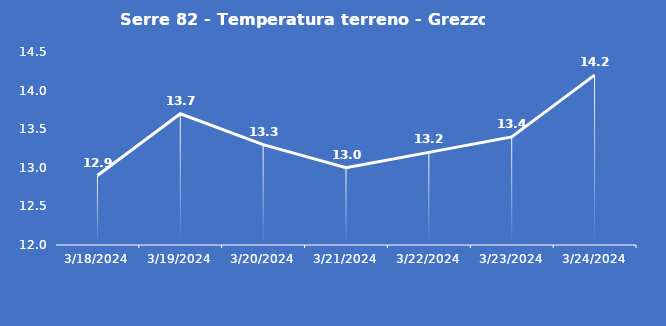
| Category | Serre 82 - Temperatura terreno - Grezzo (°C) |
|---|---|
| 3/18/24 | 12.9 |
| 3/19/24 | 13.7 |
| 3/20/24 | 13.3 |
| 3/21/24 | 13 |
| 3/22/24 | 13.2 |
| 3/23/24 | 13.4 |
| 3/24/24 | 14.2 |